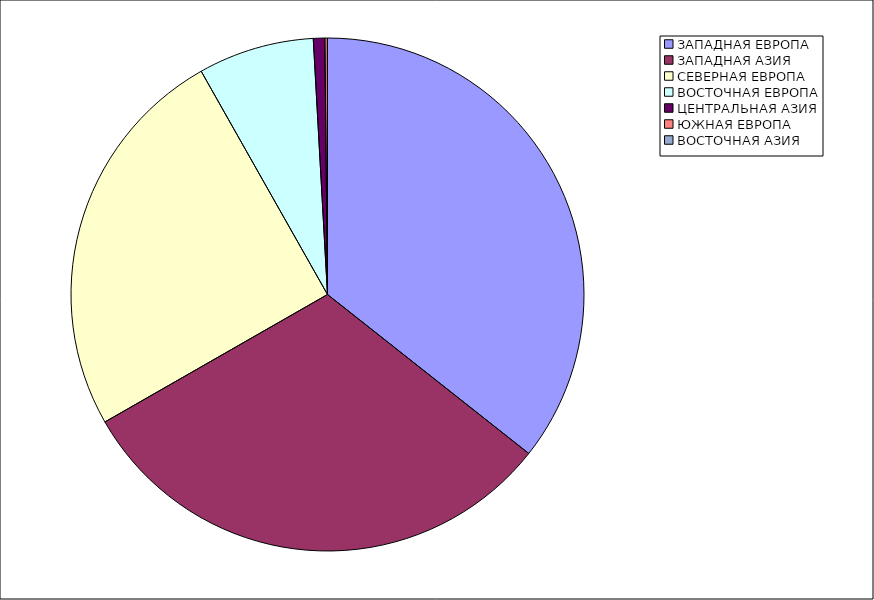
| Category | Оборот |
|---|---|
| ЗАПАДНАЯ ЕВРОПА | 35.641 |
| ЗАПАДНАЯ АЗИЯ | 31.082 |
| СЕВЕРНАЯ ЕВРОПА | 25.081 |
| ВОСТОЧНАЯ ЕВРОПА | 7.311 |
| ЦЕНТРАЛЬНАЯ АЗИЯ | 0.719 |
| ЮЖНАЯ ЕВРОПА | 0.159 |
| ВОСТОЧНАЯ АЗИЯ | 0.006 |